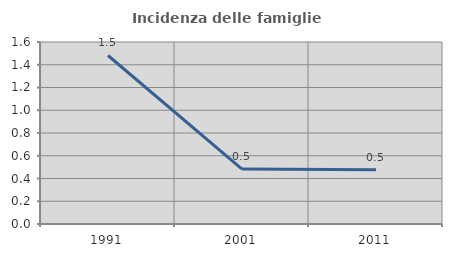
| Category | Incidenza delle famiglie numerose |
|---|---|
| 1991.0 | 1.481 |
| 2001.0 | 0.483 |
| 2011.0 | 0.476 |